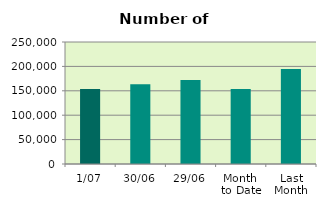
| Category | Series 0 |
|---|---|
| 1/07 | 153824 |
| 30/06 | 163178 |
| 29/06 | 171968 |
| Month 
to Date | 153824 |
| Last
Month | 194460.727 |